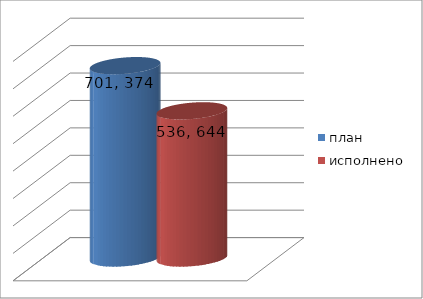
| Category | план | исполнено |
|---|---|---|
| 0 | 701374406.66 | 536644428.76 |